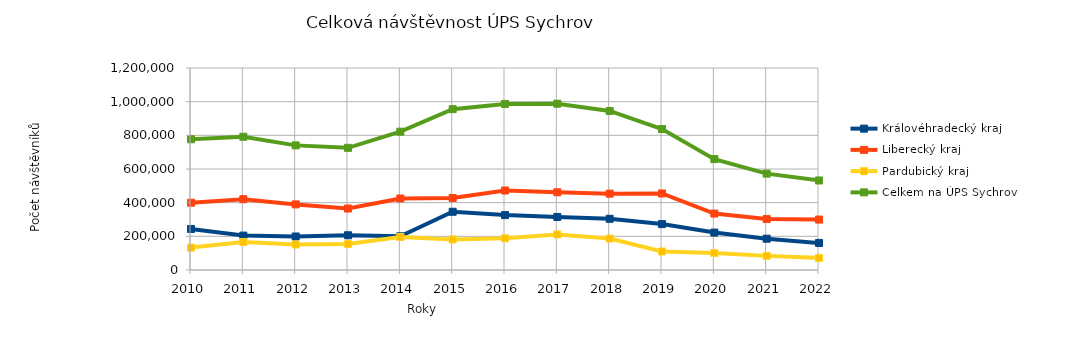
| Category | Královéhradecký kraj | Liberecký kraj | Pardubický kraj | Celkem na ÚPS Sychrov |
|---|---|---|---|---|
| 2010.0 | 243910 | 399672 | 133004 | 776586 |
| 2011.0 | 204481 | 420780 | 166238 | 791499 |
| 2012.0 | 199025 | 389781 | 151509 | 740315 |
| 2013.0 | 206419 | 365108 | 154165 | 725692 |
| 2014.0 | 200438 | 424718 | 196473 | 821629 |
| 2015.0 | 345970 | 428023 | 181567 | 955560 |
| 2016.0 | 326137 | 472318 | 188108 | 986563 |
| 2017.0 | 314983 | 461803 | 211268 | 988054 |
| 2018.0 | 304267 | 453568 | 187017 | 944852 |
| 2019.0 | 272720 | 454785 | 109949 | 837454 |
| 2020.0 | 222238 | 335261 | 101211 | 658710 |
| 2021.0 | 185934 | 302574 | 83925 | 572433 |
| 2022.0 | 160610 | 299542 | 71798 | 531950 |